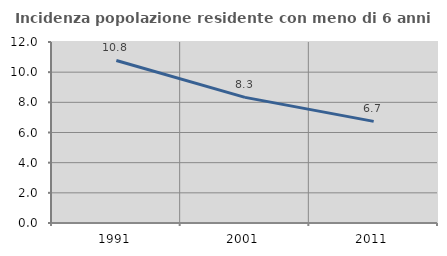
| Category | Incidenza popolazione residente con meno di 6 anni |
|---|---|
| 1991.0 | 10.776 |
| 2001.0 | 8.328 |
| 2011.0 | 6.738 |